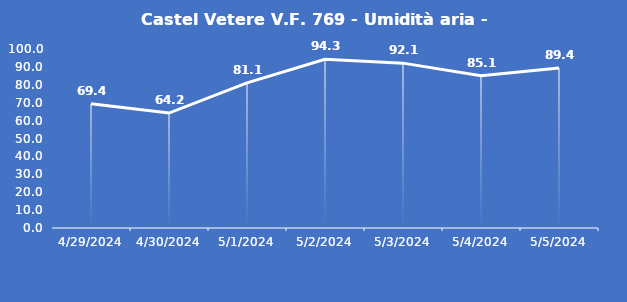
| Category | Castel Vetere V.F. 769 - Umidità aria - Grezzo (%) |
|---|---|
| 4/29/24 | 69.4 |
| 4/30/24 | 64.2 |
| 5/1/24 | 81.1 |
| 5/2/24 | 94.3 |
| 5/3/24 | 92.1 |
| 5/4/24 | 85.1 |
| 5/5/24 | 89.4 |